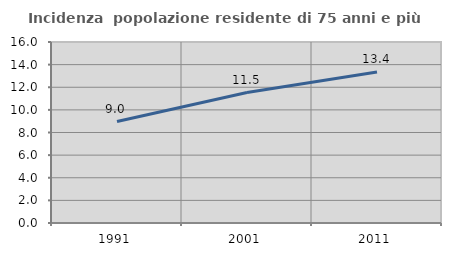
| Category | Incidenza  popolazione residente di 75 anni e più |
|---|---|
| 1991.0 | 8.971 |
| 2001.0 | 11.529 |
| 2011.0 | 13.353 |